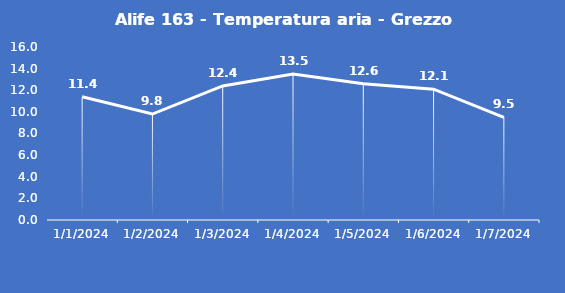
| Category | Alife 163 - Temperatura aria - Grezzo (°C) |
|---|---|
| 1/1/24 | 11.4 |
| 1/2/24 | 9.8 |
| 1/3/24 | 12.4 |
| 1/4/24 | 13.5 |
| 1/5/24 | 12.6 |
| 1/6/24 | 12.1 |
| 1/7/24 | 9.5 |